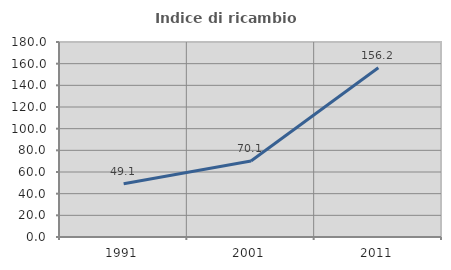
| Category | Indice di ricambio occupazionale  |
|---|---|
| 1991.0 | 49.062 |
| 2001.0 | 70.149 |
| 2011.0 | 156.164 |